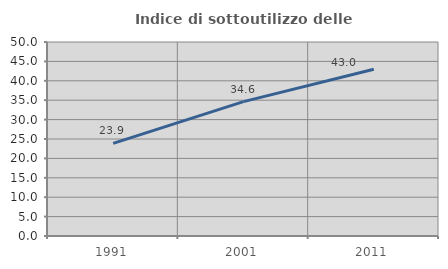
| Category | Indice di sottoutilizzo delle abitazioni  |
|---|---|
| 1991.0 | 23.874 |
| 2001.0 | 34.641 |
| 2011.0 | 42.99 |